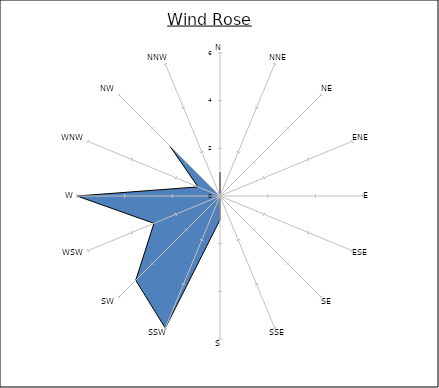
| Category | Series 0 |
|---|---|
| N | 1 |
| NNE | 0 |
| NE | 1 |
| ENE | 0 |
| E | 0 |
| ESE | 0 |
| SE | 0 |
| SSE | 0 |
| S | 1 |
| SSW | 6 |
| SW | 5 |
| WSW | 3 |
| W | 6 |
| WNW | 1 |
| NW | 3 |
| NNW | 0 |